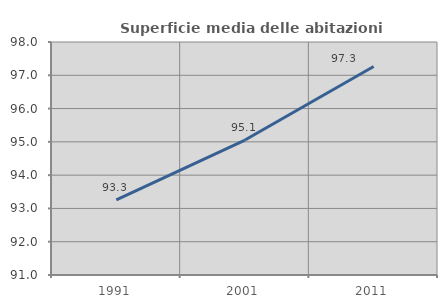
| Category | Superficie media delle abitazioni occupate |
|---|---|
| 1991.0 | 93.254 |
| 2001.0 | 95.054 |
| 2011.0 | 97.262 |